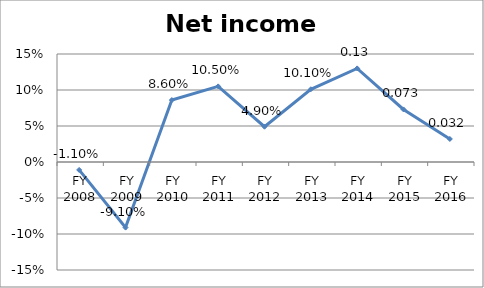
| Category | Net income ratio |
|---|---|
| FY 2016 | 0.032 |
| FY 2015 | 0.073 |
| FY 2014 | 0.13 |
| FY 2013 | 0.101 |
| FY 2012 | 0.049 |
| FY 2011 | 0.105 |
| FY 2010 | 0.086 |
| FY 2009 | -0.091 |
| FY 2008 | -0.011 |